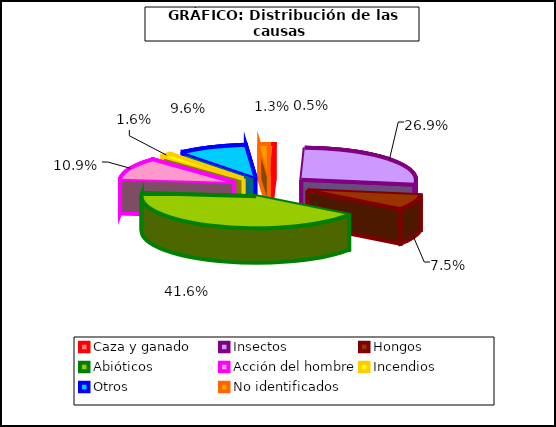
| Category | Series 0 |
|---|---|
| Caza y ganado | 22 |
| Insectos | 1204 |
| Hongos  | 336 |
| Abióticos | 1859 |
| Acción del hombre | 487 |
| Incendios | 71 |
| Otros | 430 |
| No identificados | 59 |